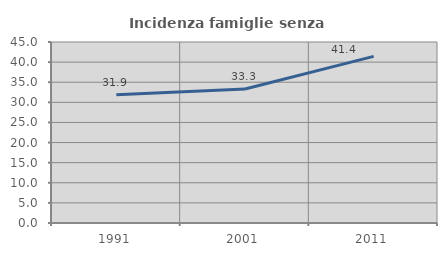
| Category | Incidenza famiglie senza nuclei |
|---|---|
| 1991.0 | 31.912 |
| 2001.0 | 33.296 |
| 2011.0 | 41.425 |